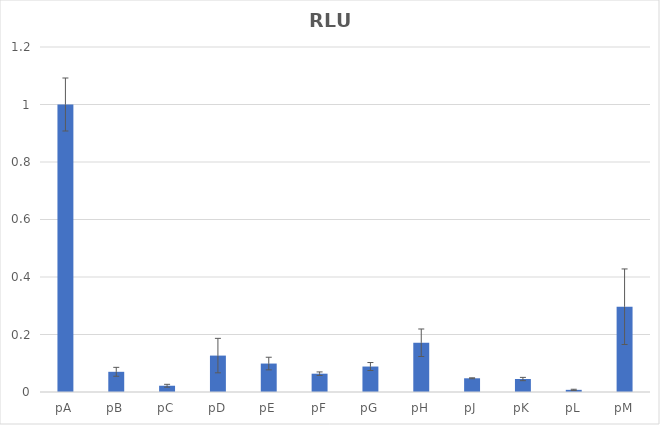
| Category | RLU FC |
|---|---|
| pA | 1 |
| pB | 0.07 |
| pC | 0.022 |
| pD | 0.127 |
| pE | 0.099 |
| pF | 0.064 |
| pG | 0.089 |
| pH | 0.171 |
| pJ | 0.048 |
| pK | 0.045 |
| pL | 0.007 |
| pM | 0.297 |